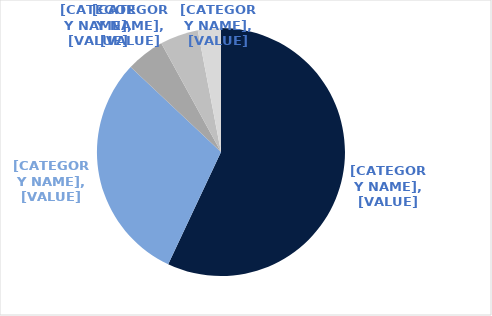
| Category | Series 0 |
|---|---|
| Sydney | 0.57 |
| Melbourne | 0.3 |
| Perth | 0.05 |
| Birsbane | 0.05 |
| Canberra | 0.03 |